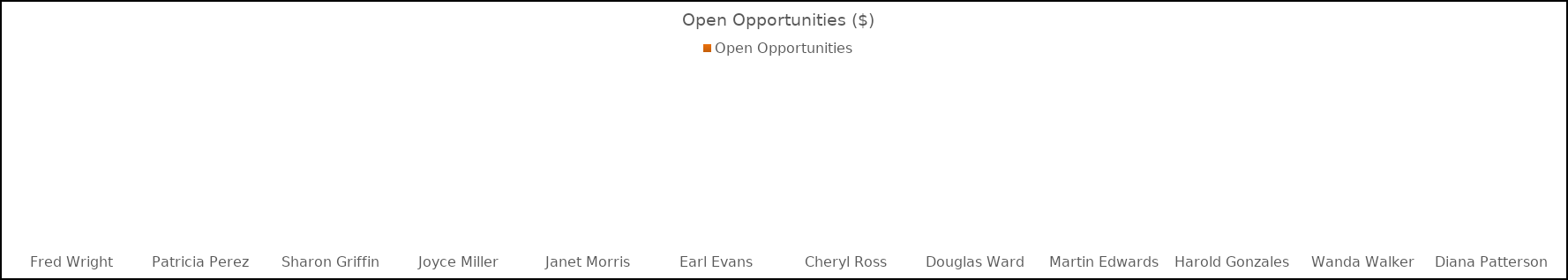
| Category | Open Opportunities  |
|---|---|
| Fred Wright | 0 |
| Patricia Perez | 0 |
| Sharon Griffin | 0 |
| Joyce Miller | 0 |
| Janet Morris | 0 |
| Earl Evans | 0 |
| Cheryl Ross | 0 |
| Douglas Ward | 0 |
| Martin Edwards | 0 |
| Harold Gonzales | 0 |
| Wanda Walker | 0 |
| Diana Patterson | 0 |